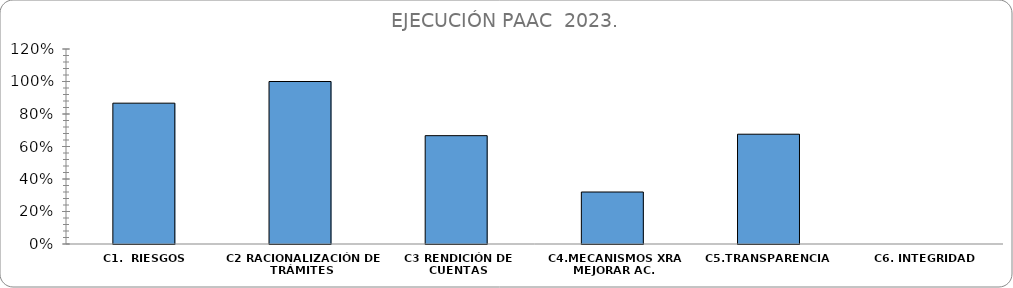
| Category | % CUMPLIMIENTO  |
|---|---|
| C1.  RIESGOS | 0.867 |
| C2 RACIONALIZACIÓN DE TRÁMITES | 1 |
| C3 RENDICIÓN DE CUENTAS | 0.667 |
| C4.MECANISMOS XRA MEJORAR AC. | 0.32 |
| C5.TRANSPARENCIA  | 0.676 |
| C6. INTEGRIDAD | 0 |